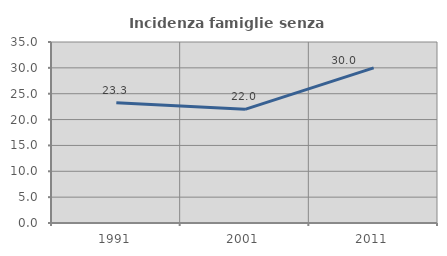
| Category | Incidenza famiglie senza nuclei |
|---|---|
| 1991.0 | 23.251 |
| 2001.0 | 21.979 |
| 2011.0 | 29.987 |